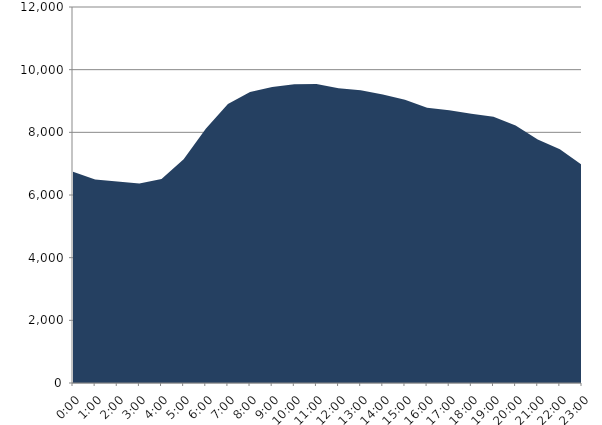
| Category | Series 0 | Series 1 |
|---|---|---|
| 2023-05-17 |  | 6744.375 |
| 2023-05-17 01:00:00 |  | 6496.647 |
| 2023-05-17 02:00:00 |  | 6434.034 |
| 2023-05-17 03:00:00 |  | 6363.829 |
| 2023-05-17 04:00:00 |  | 6511.707 |
| 2023-05-17 05:00:00 |  | 7142.975 |
| 2023-05-17 06:00:00 |  | 8110.968 |
| 2023-05-17 07:00:00 |  | 8903.154 |
| 2023-05-17 08:00:00 |  | 9288.876 |
| 2023-05-17 09:00:00 |  | 9445.861 |
| 2023-05-17 10:00:00 |  | 9538.077 |
| 2023-05-17 11:00:00 |  | 9539.002 |
| 2023-05-17 12:00:00 |  | 9410.099 |
| 2023-05-17 13:00:00 |  | 9339.397 |
| 2023-05-17 14:00:00 |  | 9205.066 |
| 2023-05-17 15:00:00 |  | 9041.426 |
| 2023-05-17 16:00:00 |  | 8782.142 |
| 2023-05-17 17:00:00 |  | 8703.066 |
| 2023-05-17 18:00:00 |  | 8590.717 |
| 2023-05-17 19:00:00 |  | 8498.178 |
| 2023-05-17 20:00:00 |  | 8216.357 |
| 2023-05-17 21:00:00 |  | 7772.75 |
| 2023-05-17 22:00:00 |  | 7459.056 |
| 2023-05-17 23:00:00 |  | 6957.266 |